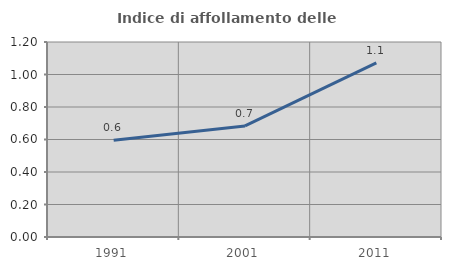
| Category | Indice di affollamento delle abitazioni  |
|---|---|
| 1991.0 | 0.595 |
| 2001.0 | 0.684 |
| 2011.0 | 1.072 |